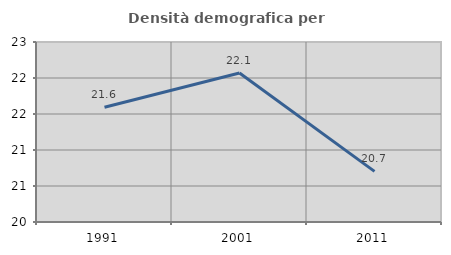
| Category | Densità demografica |
|---|---|
| 1991.0 | 21.594 |
| 2001.0 | 22.07 |
| 2011.0 | 20.703 |